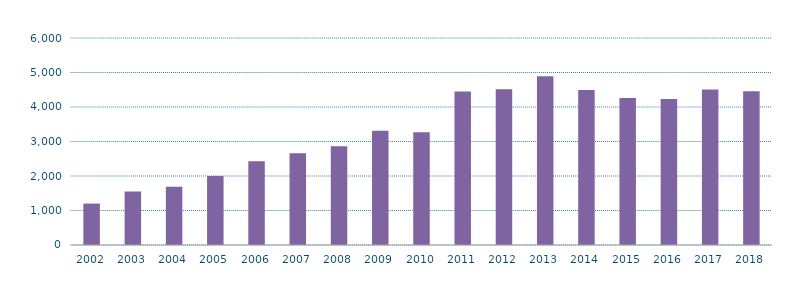
| Category | Nacional |
|---|---|
| 2002.0 | 1200.547 |
| 2003.0 | 1547.876 |
| 2004.0 | 1690.876 |
| 2005.0 | 2001.899 |
| 2006.0 | 2430.316 |
| 2007.0 | 2660.078 |
| 2008.0 | 2861.018 |
| 2009.0 | 3309.563 |
| 2010.0 | 3267.591 |
| 2011.0 | 4450.09 |
| 2012.0 | 4510.873 |
| 2013.0 | 4890.025 |
| 2014.0 | 4495.116 |
| 2015.0 | 4258.849 |
| 2016.0 | 4228.952 |
| 2017.0 | 4507.587 |
| 2018.0 | 4454.518 |